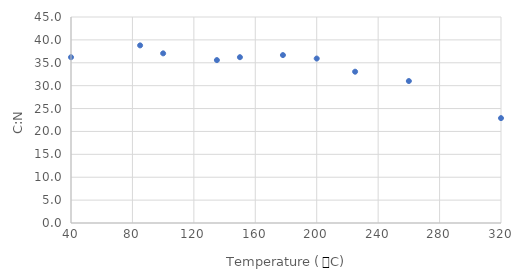
| Category | C:N |
|---|---|
| 40.0 | 36.217 |
| 85.0 | 38.798 |
| 100.0 | 37.059 |
| 135.0 | 35.585 |
| 150.0 | 36.221 |
| 178.0 | 36.68 |
| 200.0 | 35.925 |
| 225.0 | 33.049 |
| 260.0 | 31.009 |
| 320.0 | 22.911 |